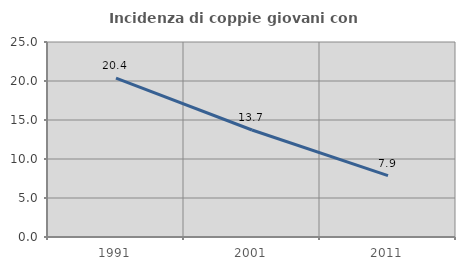
| Category | Incidenza di coppie giovani con figli |
|---|---|
| 1991.0 | 20.376 |
| 2001.0 | 13.716 |
| 2011.0 | 7.86 |